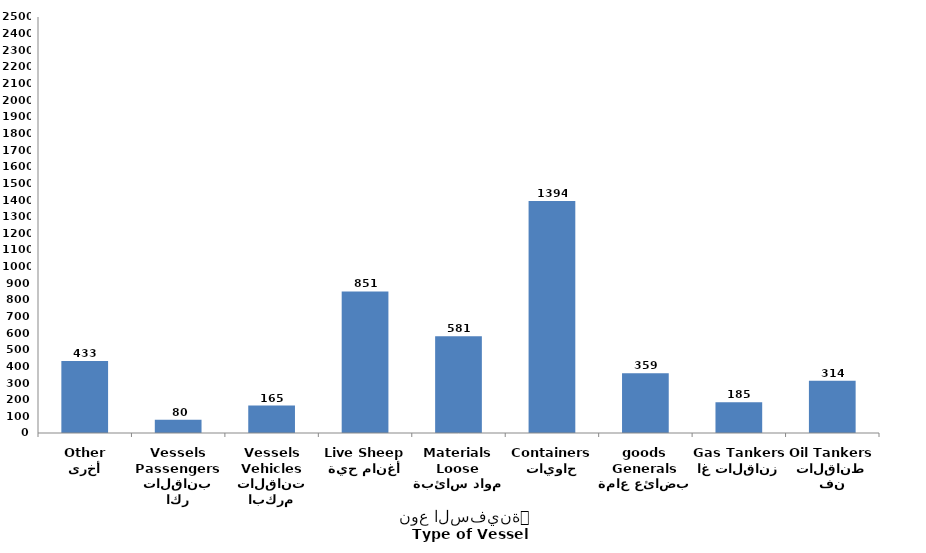
| Category | نوع السفينة
Type of Vessel |
|---|---|
| أخرى
Other | 433 |
| ناقلات ركاب
Passengers Vessels
 | 80 |
| ناقلات مركبات
Vehicles Vessels
 | 165 |
| أغنام حية
Live Sheep
 | 851 |
| مواد سائبة
Loose Materials
 | 581 |
| حاويات
Containers | 1394 |
| بضائع عامة
Generals goods
 | 359 |
| ناقلات غاز
Gas Tankers
 | 185 |
| ناقلات نفط
Oil Tankers
 | 314 |